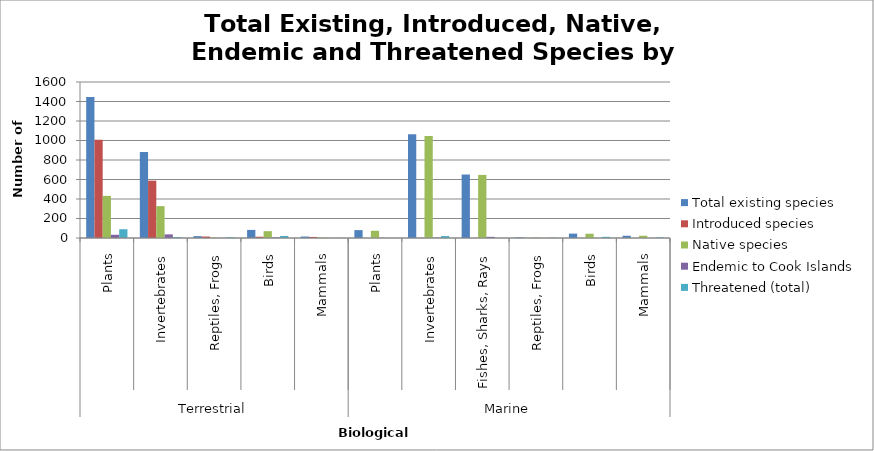
| Category | Total existing species | Introduced species | Native species | Endemic to Cook Islands | Threatened (total) |
|---|---|---|---|---|---|
| 0 | 1445 | 1008 | 432 | 33 | 90 |
| 1 | 883 | 588 | 327 | 37 | 9 |
| 2 | 19 | 15 | 4 | 0 | 7 |
| 3 | 83 | 13 | 70 | 6 | 21 |
| 4 | 15 | 11 | 4 | 0 | 1 |
| 5 | 81 | 0 | 74 | 1 | 0 |
| 6 | 1063 | 2 | 1045 | 4 | 20 |
| 7 | 651 | 0 | 647 | 12 | 0 |
| 8 | 6 | 0 | 4 | 0 | 3 |
| 9 | 45 | 0 | 44 | 0 | 12 |
| 10 | 23 | 0 | 23 | 0 | 6 |